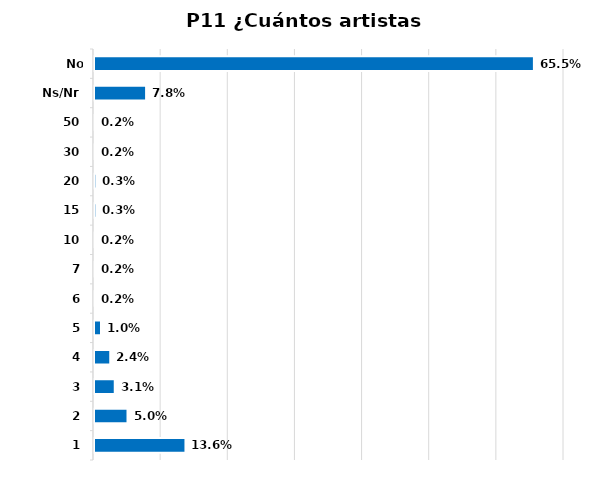
| Category | Series 0 |
|---|---|
| 1 | 0.136 |
| 2 | 0.05 |
| 3 | 0.031 |
| 4 | 0.024 |
| 5 | 0.01 |
| 6 | 0.002 |
| 7 | 0.002 |
| 10 | 0.002 |
| 15 | 0.003 |
| 20 | 0.003 |
| 30 | 0.002 |
| 50 | 0.002 |
| Ns/Nr | 0.078 |
| No aplica | 0.655 |